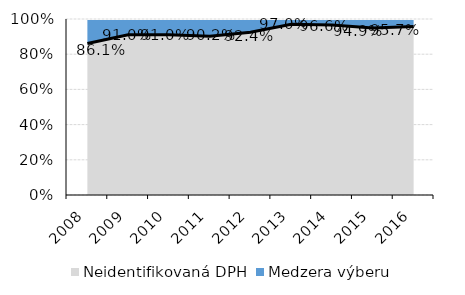
| Category | Series 2 |
|---|---|
| 0 | 0.861 |
| 1 | 0.91 |
| 2 | 0.91 |
| 3 | 0.902 |
| 4 | 0.924 |
| 5 | 0.97 |
| 6 | 0.966 |
| 7 | 0.949 |
| 8 | 0.957 |